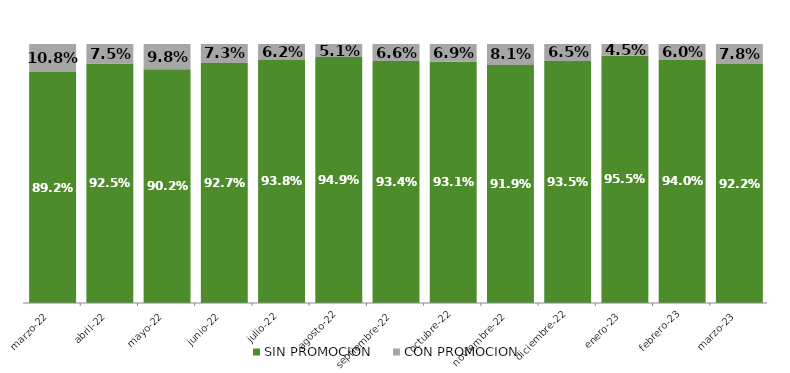
| Category | SIN PROMOCION   | CON PROMOCION   |
|---|---|---|
| 2022-03-01 | 0.892 | 0.108 |
| 2022-04-01 | 0.925 | 0.075 |
| 2022-05-01 | 0.902 | 0.098 |
| 2022-06-01 | 0.927 | 0.073 |
| 2022-07-01 | 0.938 | 0.062 |
| 2022-08-01 | 0.949 | 0.051 |
| 2022-09-01 | 0.934 | 0.066 |
| 2022-10-01 | 0.931 | 0.069 |
| 2022-11-01 | 0.919 | 0.081 |
| 2022-12-01 | 0.935 | 0.065 |
| 2023-01-01 | 0.955 | 0.045 |
| 2023-02-01 | 0.94 | 0.06 |
| 2023-03-01 | 0.922 | 0.078 |